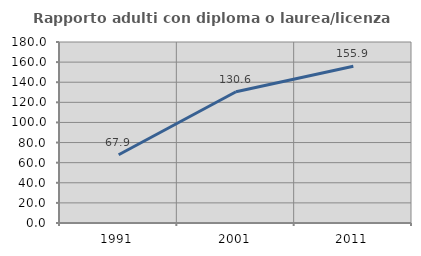
| Category | Rapporto adulti con diploma o laurea/licenza media  |
|---|---|
| 1991.0 | 67.883 |
| 2001.0 | 130.556 |
| 2011.0 | 155.882 |